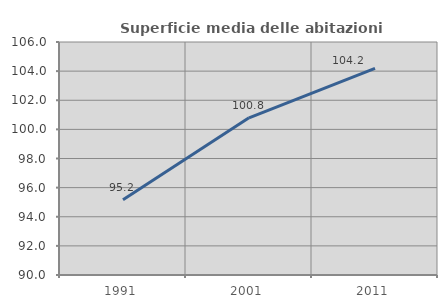
| Category | Superficie media delle abitazioni occupate |
|---|---|
| 1991.0 | 95.175 |
| 2001.0 | 100.793 |
| 2011.0 | 104.195 |